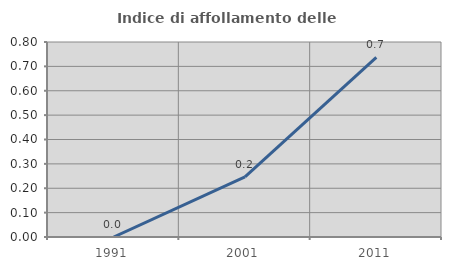
| Category | Indice di affollamento delle abitazioni  |
|---|---|
| 1991.0 | 0 |
| 2001.0 | 0.247 |
| 2011.0 | 0.737 |